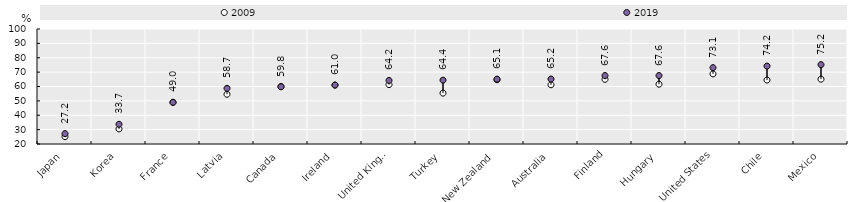
| Category | 2009 | 2019 |
|---|---|---|
| Japan | 25.1 | 27.2 |
| Korea | 30.5 | 33.7 |
| France | 49 | 49 |
| Latvia | 54.6 | 58.7 |
| Canada | 60 | 59.8 |
| Ireland | 61 | 61 |
| United Kingdom | 61.3 | 64.2 |
| Turkey | 55.4 | 64.4 |
| New Zealand | 64.7 | 65.1 |
| Australia | 61.2 | 65.2 |
| Finland | 65 | 67.6 |
| Hungary | 61.6 | 67.6 |
| United States | 68.8 | 73.1 |
| Chile | 64.5 | 74.2 |
| Mexico | 65.1 | 75.2 |